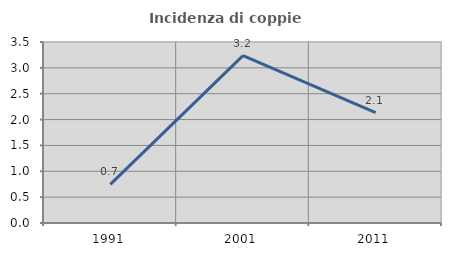
| Category | Incidenza di coppie miste |
|---|---|
| 1991.0 | 0.747 |
| 2001.0 | 3.236 |
| 2011.0 | 2.132 |